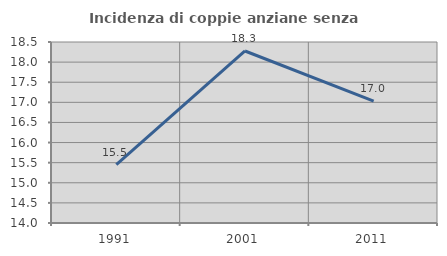
| Category | Incidenza di coppie anziane senza figli  |
|---|---|
| 1991.0 | 15.453 |
| 2001.0 | 18.276 |
| 2011.0 | 17.028 |